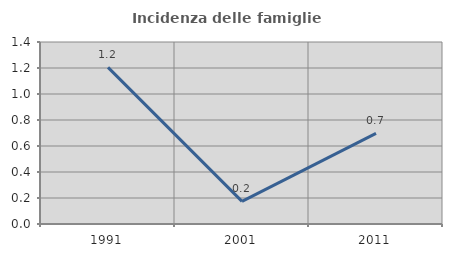
| Category | Incidenza delle famiglie numerose |
|---|---|
| 1991.0 | 1.205 |
| 2001.0 | 0.174 |
| 2011.0 | 0.698 |